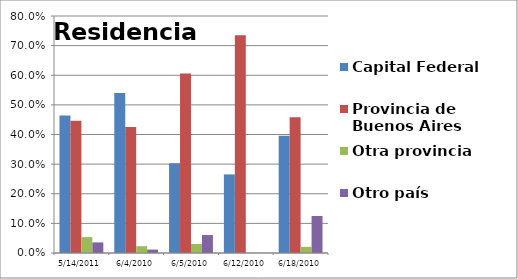
| Category | Capital Federal | Provincia de Buenos Aires | Otra provincia | Otro país |
|---|---|---|---|---|
| 14/05/2011 | 0.464 | 0.446 | 0.054 | 0.036 |
| 04/06/2010 | 0.54 | 0.425 | 0.023 | 0.011 |
| 05/06/2010 | 0.303 | 0.606 | 0.03 | 0.061 |
| 12/06/2010 | 0.265 | 0.735 | 0 | 0 |
| 18/06/2010 | 0.396 | 0.458 | 0.021 | 0.125 |